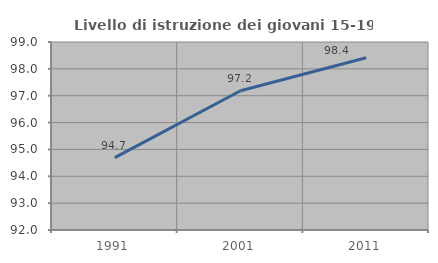
| Category | Livello di istruzione dei giovani 15-19 anni |
|---|---|
| 1991.0 | 94.697 |
| 2001.0 | 97.183 |
| 2011.0 | 98.413 |